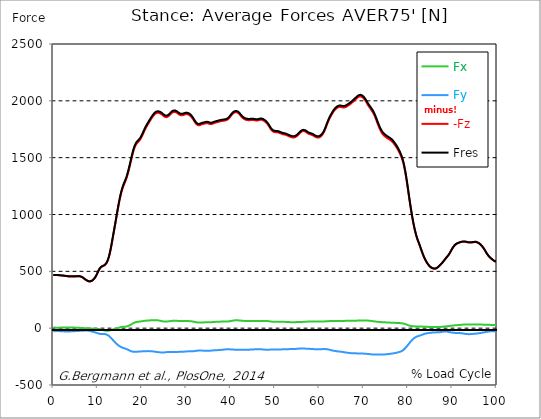
| Category |  Fx |  Fy |  -Fz |  Fres |
|---|---|---|---|---|
| 0.0 | 5.46 | -26.686 | 466.61 | 467.876 |
| 0.167348456675344 | 5.308 | -26.487 | 466.642 | 467.908 |
| 0.334696913350688 | 5.086 | -26.224 | 466.762 | 468.011 |
| 0.5020453700260321 | 4.807 | -25.937 | 466.929 | 468.162 |
| 0.669393826701376 | 4.521 | -25.699 | 467.048 | 468.266 |
| 0.83674228337672 | 4.33 | -25.571 | 466.977 | 468.178 |
| 1.0040907400520642 | 4.314 | -25.579 | 466.563 | 467.765 |
| 1.1621420602454444 | 4.441 | -25.738 | 465.839 | 467.032 |
| 1.3294905169207885 | 4.68 | -26.017 | 464.987 | 466.197 |
| 1.4968389735961325 | 4.982 | -26.367 | 464.247 | 465.464 |
| 1.6641874302714765 | 5.293 | -26.733 | 463.658 | 464.891 |
| 1.8315358869468206 | 5.595 | -27.107 | 463.156 | 464.414 |
| 1.9988843436221646 | 5.889 | -27.473 | 462.631 | 463.905 |
| 2.1662328002975086 | 6.144 | -27.84 | 461.963 | 463.252 |
| 2.333581256972853 | 6.335 | -28.198 | 461.143 | 462.456 |
| 2.5009297136481967 | 6.447 | -28.508 | 460.283 | 461.612 |
| 2.6682781703235405 | 6.462 | -28.739 | 459.456 | 460.801 |
| 2.8356266269988843 | 6.439 | -28.89 | 458.628 | 459.973 |
| 3.002975083674229 | 6.407 | -28.97 | 457.721 | 459.074 |
| 3.1703235403495724 | 6.367 | -28.994 | 456.766 | 458.119 |
| 3.337671997024917 | 6.319 | -28.97 | 455.834 | 457.187 |
| 3.4957233172182973 | 6.208 | -28.874 | 455.054 | 456.415 |
| 3.663071773893641 | 6.017 | -28.691 | 454.553 | 455.906 |
| 3.8304202305689854 | 5.778 | -28.421 | 454.346 | 455.683 |
| 3.997768687244329 | 5.523 | -28.086 | 454.338 | 455.667 |
| 4.165117143919673 | 5.308 | -27.704 | 454.41 | 455.731 |
| 4.332465600595017 | 5.141 | -27.322 | 454.466 | 455.763 |
| 4.499814057270361 | 5.014 | -26.948 | 454.513 | 455.803 |
| 4.667162513945706 | 4.895 | -26.582 | 454.672 | 455.938 |
| 4.834510970621049 | 4.767 | -26.216 | 455.039 | 456.288 |
| 5.001859427296393 | 4.624 | -25.858 | 455.596 | 456.837 |
| 5.169207883971737 | 4.465 | -25.524 | 456.193 | 457.418 |
| 5.336556340647081 | 4.25 | -25.197 | 456.598 | 457.808 |
| 5.503904797322425 | 3.94 | -24.879 | 456.758 | 457.951 |
| 5.671253253997769 | 3.526 | -24.537 | 456.694 | 457.864 |
| 5.82930457419115 | 3.008 | -24.155 | 456.384 | 457.514 |
| 5.996653030866494 | 2.475 | -23.749 | 455.62 | 456.718 |
| 6.164001487541838 | 1.982 | -23.375 | 454.139 | 455.198 |
| 6.331349944217181 | 1.544 | -23.04 | 451.736 | 452.77 |
| 6.498698400892526 | 1.154 | -22.73 | 448.401 | 449.404 |
| 6.66604685756787 | 0.772 | -22.396 | 444.262 | 445.233 |
| 6.833395314243213 | 0.366 | -22.038 | 439.535 | 440.482 |
| 7.000743770918558 | -0.08 | -21.679 | 434.521 | 435.444 |
| 7.168092227593902 | -0.565 | -21.361 | 429.515 | 430.422 |
| 7.335440684269246 | -1.074 | -21.17 | 424.819 | 425.719 |
| 7.50278914094459 | -1.568 | -21.154 | 420.593 | 421.493 |
| 7.6701375976199335 | -1.998 | -21.401 | 416.924 | 417.832 |
| 7.837486054295278 | -2.348 | -21.942 | 413.892 | 414.823 |
| 7.995537374488658 | -2.61 | -22.81 | 411.711 | 412.698 |
| 8.162885831164003 | -2.833 | -24.043 | 410.685 | 411.743 |
| 8.330234287839346 | -3.088 | -25.595 | 411.003 | 412.157 |
| 8.49758274451469 | -3.422 | -27.306 | 412.706 | 413.972 |
| 8.664931201190035 | -3.884 | -29.049 | 415.786 | 417.171 |
| 8.832279657865378 | -4.457 | -30.729 | 420.203 | 421.7 |
| 8.999628114540721 | -5.109 | -32.424 | 425.79 | 427.406 |
| 9.166976571216066 | -5.77 | -34.206 | 432.476 | 434.227 |
| 9.334325027891412 | -6.367 | -36.093 | 440.482 | 442.368 |
| 9.501673484566755 | -6.837 | -38.058 | 450.128 | 452.15 |
| 9.669021941242098 | -7.171 | -40.096 | 461.589 | 463.753 |
| 9.836370397917442 | -7.37 | -42.221 | 474.681 | 476.981 |
| 10.003718854592787 | -7.497 | -44.425 | 488.76 | 491.203 |
| 10.17106731126813 | -7.704 | -46.646 | 502.775 | 505.361 |
| 10.329118631461512 | -8.213 | -48.636 | 515.294 | 518.032 |
| 10.496467088136853 | -9.145 | -50.331 | 525.608 | 528.473 |
| 10.663815544812199 | -10.498 | -51.564 | 533.328 | 536.289 |
| 10.831164001487544 | -12.24 | -52.297 | 538.7 | 541.741 |
| 10.998512458162887 | -14.238 | -52.48 | 542.353 | 545.418 |
| 11.16586091483823 | -16.228 | -52.241 | 545.131 | 548.179 |
| 11.333209371513574 | -18.026 | -51.827 | 547.829 | 550.853 |
| 11.50055782818892 | -19.555 | -51.771 | 551.387 | 554.427 |
| 11.667906284864264 | -20.78 | -52.265 | 556.615 | 559.719 |
| 11.835254741539607 | -21.711 | -53.395 | 563.643 | 566.866 |
| 12.00260319821495 | -22.332 | -55.393 | 572.971 | 576.377 |
| 12.169951654890292 | -22.475 | -58.353 | 585.704 | 589.365 |
| 12.337300111565641 | -22.157 | -62.245 | 602.044 | 606.023 |
| 12.504648568240984 | -21.353 | -67.108 | 622.362 | 626.732 |
| 12.662699888434362 | -20.08 | -72.798 | 646.724 | 651.539 |
| 12.830048345109708 | -18.401 | -79.094 | 675.073 | 680.365 |
| 12.997396801785053 | -16.514 | -85.819 | 706.987 | 712.805 |
| 13.164745258460396 | -14.58 | -92.798 | 741.854 | 748.197 |
| 13.33209371513574 | -12.726 | -99.906 | 778.544 | 785.436 |
| 13.499442171811083 | -11.015 | -107.029 | 815.281 | 822.73 |
| 13.666790628486426 | -9.439 | -114.112 | 851.191 | 859.189 |
| 13.834139085161771 | -7.895 | -121.06 | 886.822 | 895.377 |
| 14.001487541837117 | -6.2 | -127.777 | 923.209 | 932.282 |
| 14.16883599851246 | -4.266 | -134.2 | 960.503 | 970.062 |
| 14.336184455187803 | -2.101 | -140.256 | 998.188 | 1008.176 |
| 14.503532911863147 | 0.215 | -145.907 | 1035.435 | 1045.821 |
| 14.670881368538492 | 2.507 | -151.144 | 1071.376 | 1082.128 |
| 14.828932688731873 | 4.68 | -155.927 | 1105.463 | 1116.534 |
| 14.996281145407215 | 6.653 | -160.24 | 1137.322 | 1148.687 |
| 15.163629602082558 | 8.333 | -164.069 | 1166.387 | 1177.999 |
| 15.330978058757903 | 9.686 | -167.459 | 1192.484 | 1204.302 |
| 15.498326515433247 | 10.736 | -170.388 | 1215.651 | 1227.653 |
| 15.665674972108594 | 11.5 | -172.815 | 1236.065 | 1248.202 |
| 15.833023428783937 | 12.049 | -174.845 | 1254.155 | 1266.396 |
| 16.00037188545928 | 12.487 | -176.747 | 1270.192 | 1282.552 |
| 16.167720342134626 | 13.005 | -178.713 | 1285.25 | 1297.745 |
| 16.335068798809967 | 13.808 | -181.005 | 1301.271 | 1313.933 |
| 16.502417255485312 | 15.01 | -183.647 | 1319.401 | 1332.27 |
| 16.669765712160658 | 16.65 | -186.616 | 1340.189 | 1353.289 |
| 16.837114168836 | 18.775 | -189.831 | 1363.269 | 1376.632 |
| 17.004462625511344 | 21.401 | -193.086 | 1388.204 | 1401.821 |
| 17.16251394570472 | 24.441 | -196.246 | 1414.579 | 1428.435 |
| 17.32986240238007 | 27.792 | -199.23 | 1442.06 | 1456.131 |
| 17.497210859055414 | 31.389 | -201.912 | 1470.274 | 1484.52 |
| 17.664559315730756 | 35.233 | -204.212 | 1498.304 | 1512.694 |
| 17.8319077724061 | 39.109 | -205.987 | 1525.07 | 1539.538 |
| 17.999256229081443 | 42.834 | -207.205 | 1549.678 | 1564.179 |
| 18.166604685756788 | 46.272 | -207.881 | 1571.421 | 1585.906 |
| 18.333953142432133 | 49.28 | -208.112 | 1589.925 | 1604.354 |
| 18.501301599107478 | 51.716 | -208.024 | 1604.999 | 1619.348 |
| 18.668650055782823 | 53.594 | -207.77 | 1617.064 | 1631.326 |
| 18.835998512458165 | 54.987 | -207.348 | 1626.511 | 1640.678 |
| 19.00334696913351 | 55.997 | -206.815 | 1633.984 | 1648.055 |
| 19.170695425808855 | 56.761 | -206.305 | 1640.566 | 1654.534 |
| 19.338043882484197 | 57.43 | -205.812 | 1647.363 | 1661.235 |
| 19.496095202677576 | 58.154 | -205.326 | 1655.505 | 1669.273 |
| 19.66344365935292 | 58.95 | -204.897 | 1665.198 | 1678.855 |
| 19.830792116028263 | 59.857 | -204.475 | 1676.723 | 1690.268 |
| 19.998140572703612 | 60.844 | -204.029 | 1689.783 | 1703.209 |
| 20.165489029378953 | 61.879 | -203.623 | 1703.941 | 1717.24 |
| 20.3328374860543 | 62.921 | -203.289 | 1718.641 | 1731.829 |
| 20.500185942729644 | 63.916 | -203.01 | 1733.253 | 1746.337 |
| 20.667534399404985 | 64.84 | -202.772 | 1747.245 | 1760.225 |
| 20.83488285608033 | 65.659 | -202.533 | 1760.408 | 1773.301 |
| 21.002231312755672 | 66.336 | -202.286 | 1772.712 | 1785.51 |
| 21.16957976943102 | 66.877 | -202.055 | 1784.189 | 1796.891 |
| 21.336928226106362 | 67.339 | -201.912 | 1795.259 | 1807.89 |
| 21.504276682781704 | 67.784 | -201.896 | 1806.179 | 1818.746 |
| 21.67162513945705 | 68.222 | -202.04 | 1816.835 | 1829.354 |
| 21.82967645965043 | 68.668 | -202.326 | 1827.222 | 1839.725 |
| 21.997024916325774 | 69.089 | -202.66 | 1837.417 | 1849.904 |
| 22.16437337300112 | 69.487 | -203.13 | 1847.365 | 1859.86 |
| 22.33172182967646 | 69.83 | -203.751 | 1856.995 | 1869.506 |
| 22.499070286351806 | 70.108 | -204.562 | 1866.148 | 1878.698 |
| 22.666418743027148 | 70.339 | -205.525 | 1874.504 | 1887.111 |
| 22.833767199702496 | 70.506 | -206.576 | 1881.747 | 1894.425 |
| 23.00111565637784 | 70.546 | -207.603 | 1887.541 | 1900.298 |
| 23.168464113053183 | 70.395 | -208.534 | 1891.591 | 1904.413 |
| 23.335812569728528 | 69.965 | -209.433 | 1894.027 | 1906.912 |
| 23.50316102640387 | 69.241 | -210.332 | 1895.093 | 1908.034 |
| 23.670509483079215 | 68.262 | -211.144 | 1894.95 | 1907.947 |
| 23.83785793975456 | 67.076 | -211.845 | 1893.732 | 1906.769 |
| 23.995909259947936 | 65.715 | -212.465 | 1891.584 | 1904.66 |
| 24.163257716623285 | 64.251 | -213.015 | 1888.583 | 1901.691 |
| 24.330606173298627 | 62.73 | -213.484 | 1884.707 | 1897.839 |
| 24.49795462997397 | 61.37 | -213.779 | 1879.757 | 1892.921 |
| 24.665303086649313 | 60.2 | -213.858 | 1873.955 | 1887.135 |
| 24.83265154332466 | 59.284 | -213.675 | 1868.034 | 1881.213 |
| 25.0 | 58.679 | -213.245 | 1862.916 | 1876.056 |
| 25.167348456675345 | 58.385 | -212.633 | 1858.985 | 1872.077 |
| 25.334696913350694 | 58.353 | -211.892 | 1856.613 | 1869.633 |
| 25.502045370026035 | 58.488 | -211.136 | 1856.096 | 1869.037 |
| 25.669393826701377 | 58.815 | -210.42 | 1857.536 | 1870.397 |
| 25.836742283376722 | 59.316 | -209.839 | 1860.911 | 1873.7 |
| 26.004090740052067 | 59.985 | -209.425 | 1866.028 | 1878.754 |
| 26.17143919672741 | 60.812 | -209.178 | 1872.451 | 1885.129 |
| 26.329490516920792 | 61.744 | -209.059 | 1879.454 | 1892.101 |
| 26.49683897359613 | 62.675 | -208.995 | 1886.164 | 1898.786 |
| 26.66418743027148 | 63.55 | -208.987 | 1892.141 | 1904.755 |
| 26.831535886946828 | 64.33 | -209.019 | 1897.099 | 1909.705 |
| 26.998884343622166 | 64.967 | -209.067 | 1900.768 | 1913.382 |
| 27.166232800297514 | 65.373 | -209.107 | 1902.853 | 1915.476 |
| 27.333581256972852 | 65.524 | -209.107 | 1903.307 | 1915.929 |
| 27.5009297136482 | 65.428 | -209.075 | 1902.24 | 1914.863 |
| 27.668278170323543 | 65.158 | -209.011 | 1899.861 | 1912.491 |
| 27.835626626998888 | 64.728 | -208.916 | 1896.327 | 1908.957 |
| 28.002975083674233 | 64.163 | -208.788 | 1891.639 | 1904.27 |
| 28.170323540349575 | 63.518 | -208.621 | 1886.172 | 1898.802 |
| 28.33767199702492 | 62.914 | -208.446 | 1880.863 | 1893.494 |
| 28.50502045370026 | 62.484 | -208.295 | 1876.78 | 1889.411 |
| 28.663071773893645 | 62.269 | -208.168 | 1874.122 | 1886.761 |
| 28.830420230568986 | 62.229 | -208.04 | 1872.849 | 1885.487 |
| 28.99776868724433 | 62.285 | -207.881 | 1872.785 | 1885.416 |
| 29.165117143919673 | 62.412 | -207.658 | 1873.796 | 1886.402 |
| 29.33246560059502 | 62.627 | -207.348 | 1875.738 | 1888.312 |
| 29.499814057270367 | 62.937 | -206.839 | 1878.285 | 1890.796 |
| 29.66716251394571 | 63.168 | -206.154 | 1880.76 | 1893.183 |
| 29.834510970621054 | 63.232 | -205.446 | 1882.71 | 1895.046 |
| 30.00185942729639 | 63.128 | -204.817 | 1883.649 | 1895.913 |
| 30.169207883971744 | 62.914 | -204.3 | 1883.529 | 1895.722 |
| 30.33655634064708 | 62.611 | -203.942 | 1882.208 | 1894.361 |
| 30.50390479732243 | 62.237 | -203.798 | 1879.415 | 1891.552 |
| 30.671253253997772 | 61.823 | -203.87 | 1875.396 | 1887.556 |
| 30.829304574191156 | 61.393 | -204.053 | 1870.421 | 1882.614 |
| 30.996653030866494 | 60.932 | -204.228 | 1864.627 | 1876.86 |
| 31.164001487541842 | 60.351 | -204.268 | 1857.751 | 1870 |
| 31.331349944217187 | 59.539 | -204.005 | 1849.355 | 1861.611 |
| 31.498698400892525 | 58.496 | -203.472 | 1839.741 | 1851.957 |
| 31.666046857567874 | 57.239 | -202.652 | 1829.259 | 1841.42 |
| 31.833395314243212 | 55.814 | -201.61 | 1818.427 | 1830.501 |
| 32.00074377091856 | 54.302 | -200.48 | 1808.367 | 1820.337 |
| 32.1680922275939 | 52.83 | -199.421 | 1799.724 | 1811.591 |
| 32.33544068426925 | 51.517 | -198.554 | 1792.8 | 1804.587 |
| 32.50278914094459 | 50.418 | -197.869 | 1787.762 | 1799.47 |
| 32.670137597619934 | 49.646 | -197.344 | 1784.985 | 1796.636 |
| 32.83748605429528 | 49.217 | -197.01 | 1784.499 | 1796.103 |
| 33.004834510970625 | 49.089 | -196.874 | 1785.852 | 1797.424 |
| 33.162885831164004 | 49.225 | -196.882 | 1788.407 | 1799.971 |
| 33.33023428783935 | 49.511 | -197.041 | 1791.376 | 1802.94 |
| 33.497582744514695 | 49.829 | -197.304 | 1793.954 | 1805.534 |
| 33.664931201190036 | 50.156 | -197.567 | 1795.984 | 1807.579 |
| 33.83227965786538 | 50.49 | -197.774 | 1797.496 | 1809.108 |
| 33.99962811454073 | 50.84 | -197.965 | 1798.833 | 1810.461 |
| 34.16697657121607 | 51.198 | -198.219 | 1800.472 | 1812.124 |
| 34.33432502789141 | 51.541 | -198.506 | 1802.279 | 1813.946 |
| 34.50167348456676 | 51.819 | -198.832 | 1803.6 | 1815.299 |
| 34.6690219412421 | 52.018 | -199.15 | 1803.863 | 1815.602 |
| 34.83637039791744 | 52.153 | -199.334 | 1802.94 | 1814.703 |
| 35.00371885459279 | 52.217 | -199.27 | 1801.014 | 1812.776 |
| 35.17106731126814 | 52.257 | -198.928 | 1798.499 | 1810.246 |
| 35.338415767943474 | 52.313 | -198.394 | 1796.334 | 1808.033 |
| 35.49646708813686 | 52.456 | -197.758 | 1795.411 | 1807.054 |
| 35.6638155448122 | 52.726 | -197.113 | 1795.872 | 1807.444 |
| 35.831164001487544 | 53.1 | -196.492 | 1797.552 | 1809.06 |
| 35.998512458162885 | 53.586 | -195.927 | 1799.979 | 1811.424 |
| 36.165860914838234 | 54.119 | -195.362 | 1802.605 | 1813.986 |
| 36.333209371513576 | 54.66 | -194.861 | 1805.192 | 1816.525 |
| 36.50055782818892 | 55.17 | -194.455 | 1807.564 | 1818.857 |
| 36.667906284864266 | 55.647 | -194.089 | 1809.609 | 1820.863 |
| 36.83525474153961 | 56.085 | -193.715 | 1811.376 | 1822.59 |
| 37.002603198214956 | 56.467 | -193.253 | 1812.999 | 1824.173 |
| 37.1699516548903 | 56.777 | -192.712 | 1814.615 | 1825.725 |
| 37.337300111565646 | 57.024 | -192.131 | 1816.318 | 1827.373 |
| 37.50464856824098 | 57.255 | -191.637 | 1818.109 | 1829.1 |
| 37.66269988843437 | 57.494 | -191.232 | 1819.764 | 1830.715 |
| 37.83004834510971 | 57.748 | -190.818 | 1821.213 | 1832.116 |
| 37.99739680178505 | 57.979 | -190.348 | 1822.462 | 1833.326 |
| 38.16474525846039 | 58.146 | -189.799 | 1823.624 | 1834.432 |
| 38.33209371513574 | 58.21 | -189.162 | 1824.707 | 1835.443 |
| 38.49944217181109 | 58.17 | -188.398 | 1825.638 | 1836.286 |
| 38.666790628486424 | 58.098 | -187.61 | 1826.545 | 1837.114 |
| 38.83413908516178 | 58.075 | -186.878 | 1827.803 | 1838.284 |
| 39.001487541837115 | 58.186 | -186.321 | 1829.808 | 1840.234 |
| 39.16883599851246 | 58.488 | -185.995 | 1832.737 | 1843.123 |
| 39.336184455187805 | 59.014 | -185.875 | 1836.804 | 1847.174 |
| 39.503532911863154 | 59.762 | -185.907 | 1842.232 | 1852.594 |
| 39.670881368538495 | 60.669 | -186.066 | 1849.052 | 1859.422 |
| 39.83822982521384 | 61.696 | -186.353 | 1857.027 | 1867.413 |
| 39.996281145407224 | 62.834 | -186.751 | 1865.598 | 1876.024 |
| 40.163629602082565 | 64.02 | -187.212 | 1874.066 | 1884.524 |
| 40.33097805875791 | 65.229 | -187.714 | 1881.675 | 1892.18 |
| 40.498326515433256 | 66.376 | -188.207 | 1888.05 | 1898.611 |
| 40.6656749721086 | 67.37 | -188.653 | 1893.112 | 1903.721 |
| 40.83302342878393 | 68.19 | -189.011 | 1896.892 | 1907.541 |
| 41.00037188545929 | 68.795 | -189.298 | 1899.343 | 1910.032 |
| 41.16772034213463 | 69.177 | -189.544 | 1900.306 | 1911.027 |
| 41.33506879880997 | 69.312 | -189.759 | 1899.709 | 1910.454 |
| 41.50241725548531 | 69.185 | -189.95 | 1897.576 | 1908.345 |
| 41.66976571216066 | 68.843 | -190.117 | 1893.884 | 1904.684 |
| 41.837114168836 | 68.333 | -190.285 | 1888.695 | 1899.518 |
| 42.004462625511344 | 67.705 | -190.444 | 1882.089 | 1892.952 |
| 42.17181108218669 | 66.98 | -190.579 | 1874.21 | 1885.105 |
| 42.32986240238007 | 66.232 | -190.698 | 1865.67 | 1876.597 |
| 42.497210859055414 | 65.532 | -190.786 | 1857.799 | 1868.758 |
| 42.66455931573076 | 64.943 | -190.873 | 1851.185 | 1862.168 |
| 42.831907772406105 | 64.489 | -190.913 | 1845.781 | 1856.788 |
| 42.999256229081446 | 64.139 | -190.873 | 1841.324 | 1852.339 |
| 43.16660468575679 | 63.861 | -190.73 | 1837.544 | 1848.559 |
| 43.33395314243214 | 63.654 | -190.531 | 1834.575 | 1845.574 |
| 43.50130159910748 | 63.518 | -190.292 | 1832.442 | 1843.417 |
| 43.66865005578282 | 63.463 | -190.022 | 1831.082 | 1842.033 |
| 43.83599851245817 | 63.487 | -189.719 | 1830.381 | 1841.308 |
| 44.00334696913351 | 63.534 | -189.401 | 1830.031 | 1840.934 |
| 44.17069542580886 | 63.598 | -189.107 | 1829.951 | 1840.823 |
| 44.3380438824842 | 63.709 | -188.804 | 1830.23 | 1841.062 |
| 44.49609520267758 | 63.805 | -188.494 | 1830.819 | 1841.619 |
| 44.66344365935292 | 63.861 | -188.136 | 1831.591 | 1842.359 |
| 44.83079211602827 | 63.853 | -187.73 | 1832.132 | 1842.852 |
| 44.99814057270361 | 63.765 | -187.3 | 1831.989 | 1842.669 |
| 45.16548902937895 | 63.638 | -186.87 | 1831.28 | 1841.913 |
| 45.332837486054295 | 63.487 | -186.448 | 1830.095 | 1840.688 |
| 45.500185942729644 | 63.327 | -186.043 | 1828.71 | 1839.263 |
| 45.66753439940499 | 63.184 | -185.661 | 1827.619 | 1838.133 |
| 45.83488285608033 | 63.073 | -185.31 | 1827.214 | 1837.695 |
| 46.00223131275568 | 62.977 | -185.008 | 1827.564 | 1838.014 |
| 46.16957976943102 | 62.914 | -184.801 | 1828.662 | 1839.08 |
| 46.336928226106366 | 62.898 | -184.777 | 1830.365 | 1840.775 |
| 46.50427668278171 | 62.953 | -184.96 | 1832.1 | 1842.526 |
| 46.671625139457056 | 63.112 | -185.302 | 1833.302 | 1843.76 |
| 46.829676459650436 | 63.359 | -185.764 | 1833.628 | 1844.142 |
| 46.99702491632577 | 63.63 | -186.297 | 1833 | 1843.585 |
| 47.16437337300112 | 63.892 | -186.862 | 1831.376 | 1842.033 |
| 47.33172182967646 | 64.06 | -187.451 | 1828.734 | 1839.47 |
| 47.49907028635181 | 64.107 | -188.024 | 1825.152 | 1835.968 |
| 47.66641874302716 | 64.02 | -188.557 | 1820.743 | 1831.631 |
| 47.83376719970249 | 63.877 | -189.075 | 1815.61 | 1826.593 |
| 48.001115656377834 | 63.614 | -189.505 | 1809.617 | 1820.664 |
| 48.16846411305319 | 63.224 | -189.751 | 1802.621 | 1813.724 |
| 48.33581256972853 | 62.675 | -189.799 | 1794.591 | 1805.733 |
| 48.50316102640387 | 61.919 | -189.648 | 1785.526 | 1796.684 |
| 48.67050948307921 | 60.988 | -189.314 | 1775.586 | 1786.736 |
| 48.837857939754564 | 59.929 | -188.796 | 1764.897 | 1776.023 |
| 49.005206396429905 | 58.831 | -188.231 | 1754.288 | 1765.382 |
| 49.163257716623285 | 57.828 | -187.762 | 1744.984 | 1756.055 |
| 49.33060617329863 | 56.944 | -187.427 | 1737.384 | 1748.438 |
| 49.49795462997397 | 56.252 | -187.204 | 1731.669 | 1742.716 |
| 49.66530308664932 | 55.783 | -187.029 | 1727.698 | 1738.737 |
| 49.832651543324666 | 55.528 | -186.886 | 1725.406 | 1736.445 |
| 50.0 | 55.432 | -186.807 | 1724.411 | 1735.442 |
| 50.16734845667534 | 55.456 | -186.791 | 1724.101 | 1735.131 |
| 50.33469691335069 | 55.552 | -186.83 | 1723.846 | 1734.893 |
| 50.50204537002604 | 55.679 | -186.926 | 1723.217 | 1734.296 |
| 50.66939382670139 | 55.783 | -187.045 | 1722.175 | 1733.269 |
| 50.836742283376715 | 55.814 | -187.117 | 1720.591 | 1731.709 |
| 51.00409074005207 | 55.719 | -187.093 | 1718.291 | 1729.417 |
| 51.17143919672741 | 55.56 | -186.982 | 1715.362 | 1726.488 |
| 51.32949051692079 | 55.416 | -186.815 | 1712.306 | 1723.432 |
| 51.496838973596134 | 55.385 | -186.639 | 1709.656 | 1720.782 |
| 51.66418743027148 | 55.432 | -186.48 | 1707.451 | 1718.569 |
| 51.831535886946824 | 55.528 | -186.345 | 1705.676 | 1716.803 |
| 51.99888434362217 | 55.552 | -186.162 | 1704.291 | 1715.418 |
| 52.16623280029752 | 55.4 | -185.828 | 1703.313 | 1714.399 |
| 52.33358125697285 | 55.146 | -185.462 | 1702.159 | 1713.205 |
| 52.5009297136482 | 54.915 | -185.239 | 1700.105 | 1711.144 |
| 52.668278170323546 | 54.668 | -185.095 | 1697.28 | 1708.311 |
| 52.835626626998895 | 54.366 | -184.952 | 1694.104 | 1705.127 |
| 53.00297508367424 | 54.008 | -184.737 | 1690.913 | 1701.92 |
| 53.17032354034958 | 53.602 | -184.419 | 1687.968 | 1698.951 |
| 53.33767199702492 | 53.18 | -184.045 | 1685.302 | 1696.253 |
| 53.50502045370027 | 52.758 | -183.687 | 1682.962 | 1693.882 |
| 53.663071773893655 | 52.376 | -183.376 | 1681.02 | 1691.916 |
| 53.83042023056899 | 52.098 | -183.154 | 1679.381 | 1690.26 |
| 53.99776868724433 | 51.986 | -183.058 | 1677.988 | 1688.86 |
| 54.16511714391967 | 52.05 | -183.018 | 1677.256 | 1688.127 |
| 54.33246560059503 | 52.249 | -182.947 | 1677.805 | 1688.677 |
| 54.49981405727037 | 52.583 | -182.764 | 1679.699 | 1690.555 |
| 54.667162513945705 | 53.005 | -182.477 | 1682.827 | 1693.651 |
| 54.834510970621054 | 53.451 | -182.079 | 1686.981 | 1697.765 |
| 55.0018594272964 | 53.88 | -181.562 | 1692.091 | 1702.811 |
| 55.169207883971744 | 54.207 | -180.925 | 1698.1 | 1708.74 |
| 55.336556340647086 | 54.35 | -180.225 | 1704.841 | 1715.394 |
| 55.50390479732243 | 54.382 | -179.564 | 1711.86 | 1722.318 |
| 55.671253253997776 | 54.43 | -179.039 | 1718.609 | 1728.987 |
| 55.83860171067312 | 54.557 | -178.721 | 1724.562 | 1734.885 |
| 55.9966530308665 | 54.788 | -178.633 | 1729.33 | 1739.636 |
| 56.16400148754184 | 55.034 | -178.689 | 1732.68 | 1742.987 |
| 56.33134994421718 | 55.337 | -178.896 | 1734.383 | 1744.706 |
| 56.498698400892536 | 55.719 | -179.222 | 1734.471 | 1744.833 |
| 56.66604685756788 | 56.172 | -179.596 | 1733.022 | 1743.44 |
| 56.83339531424321 | 56.642 | -179.938 | 1730.181 | 1740.663 |
| 57.00074377091856 | 57.064 | -180.296 | 1726.122 | 1736.66 |
| 57.16809222759391 | 57.366 | -180.662 | 1721.315 | 1731.932 |
| 57.33544068426925 | 57.621 | -181.052 | 1716.532 | 1727.213 |
| 57.5027891409446 | 57.892 | -181.442 | 1712.473 | 1723.225 |
| 57.670137597619934 | 58.083 | -181.769 | 1709.321 | 1720.121 |
| 57.83748605429528 | 58.194 | -182.055 | 1706.806 | 1717.646 |
| 58.004834510970625 | 58.226 | -182.358 | 1704.642 | 1715.529 |
| 58.16288583116401 | 58.202 | -182.74 | 1702.604 | 1713.532 |
| 58.330234287839346 | 58.138 | -183.201 | 1700.36 | 1711.351 |
| 58.497582744514695 | 58.091 | -183.695 | 1697.471 | 1708.526 |
| 58.66493120119004 | 58.019 | -184.204 | 1693.874 | 1704.992 |
| 58.832279657865385 | 57.915 | -184.682 | 1689.719 | 1700.917 |
| 58.999628114540734 | 57.78 | -185.111 | 1685.445 | 1696.699 |
| 59.16697657121607 | 57.709 | -185.469 | 1681.713 | 1693.022 |
| 59.33432502789142 | 57.716 | -185.748 | 1678.8 | 1690.157 |
| 59.50167348456676 | 57.772 | -185.899 | 1676.914 | 1688.302 |
| 59.66902194124211 | 57.82 | -185.987 | 1676.213 | 1687.618 |
| 59.83637039791745 | 57.876 | -185.987 | 1676.746 | 1688.143 |
| 60.00371885459278 | 57.971 | -185.891 | 1678.641 | 1690.022 |
| 60.17106731126813 | 58.106 | -185.684 | 1681.967 | 1693.316 |
| 60.33841576794349 | 58.274 | -185.382 | 1686.711 | 1698.004 |
| 60.49646708813685 | 58.473 | -184.976 | 1693.014 | 1704.228 |
| 60.6638155448122 | 58.695 | -184.53 | 1700.981 | 1712.115 |
| 60.831164001487544 | 58.966 | -184.14 | 1710.674 | 1721.721 |
| 60.99851245816289 | 59.268 | -183.878 | 1722.278 | 1733.237 |
| 61.16586091483824 | 59.579 | -183.782 | 1735.832 | 1746.703 |
| 61.333209371513576 | 59.857 | -183.91 | 1751.192 | 1762 |
| 61.50055782818892 | 60.176 | -184.3 | 1768.009 | 1778.761 |
| 61.667906284864266 | 60.613 | -184.992 | 1785.629 | 1796.358 |
| 61.835254741539615 | 61.123 | -185.947 | 1802.725 | 1813.469 |
| 62.002603198214956 | 61.624 | -187.157 | 1818.491 | 1829.283 |
| 62.16995165489029 | 62.03 | -188.518 | 1833.581 | 1844.444 |
| 62.33730011156564 | 62.333 | -190.038 | 1847.588 | 1858.531 |
| 62.504648568240995 | 62.524 | -191.749 | 1860.075 | 1871.13 |
| 62.67199702491633 | 62.643 | -193.516 | 1871.448 | 1882.622 |
| 62.83004834510971 | 62.667 | -195.227 | 1882.336 | 1893.621 |
| 62.99739680178505 | 62.579 | -196.763 | 1893.334 | 1904.715 |
| 63.1647452584604 | 62.524 | -198.108 | 1903.896 | 1915.34 |
| 63.33209371513575 | 62.539 | -199.342 | 1913.104 | 1924.62 |
| 63.4994421718111 | 62.547 | -200.472 | 1921.007 | 1932.595 |
| 63.666790628486424 | 62.508 | -201.506 | 1927.748 | 1939.399 |
| 63.83413908516177 | 62.428 | -202.461 | 1933.502 | 1945.225 |
| 64.00148754183712 | 62.293 | -203.321 | 1938.325 | 1950.104 |
| 64.16883599851248 | 62.173 | -204.101 | 1942.209 | 1954.043 |
| 64.3361844551878 | 62.062 | -204.841 | 1945.122 | 1957.02 |
| 64.50353291186315 | 61.974 | -205.573 | 1946.92 | 1958.882 |
| 64.6708813685385 | 61.935 | -206.337 | 1947.493 | 1959.535 |
| 64.83822982521384 | 62.006 | -207.149 | 1946.896 | 1959.041 |
| 65.00557828188919 | 62.261 | -207.993 | 1945.297 | 1957.561 |
| 65.16362960208257 | 62.715 | -208.916 | 1943.22 | 1955.619 |
| 65.3309780587579 | 63.216 | -209.887 | 1941.548 | 1954.091 |
| 65.49832651543326 | 63.646 | -210.866 | 1940.991 | 1953.685 |
| 65.6656749721086 | 64.004 | -211.884 | 1941.715 | 1954.537 |
| 65.83302342878395 | 64.282 | -212.943 | 1943.665 | 1956.614 |
| 66.00037188545929 | 64.505 | -214.025 | 1946.634 | 1959.694 |
| 66.16772034213463 | 64.696 | -215.076 | 1950.534 | 1963.697 |
| 66.33506879880998 | 64.824 | -216.071 | 1954.831 | 1968.083 |
| 66.50241725548531 | 64.903 | -217.026 | 1958.946 | 1972.277 |
| 66.66976571216065 | 65.007 | -217.885 | 1962.878 | 1976.288 |
| 66.83711416883601 | 65.086 | -218.649 | 1967.127 | 1980.586 |
| 67.00446262551135 | 65.062 | -219.27 | 1971.99 | 1985.488 |
| 67.1718110821867 | 64.999 | -219.803 | 1977.41 | 1990.932 |
| 67.32986240238007 | 64.983 | -220.273 | 1983.172 | 1996.71 |
| 67.49721085905541 | 65.086 | -220.679 | 1989.093 | 2002.639 |
| 67.66455931573076 | 65.206 | -220.886 | 1995.031 | 2008.56 |
| 67.83190777240611 | 65.341 | -221.029 | 2000.904 | 2014.418 |
| 67.99925622908145 | 65.5 | -221.22 | 2006.627 | 2020.132 |
| 68.16660468575678 | 65.691 | -221.435 | 2012.46 | 2025.958 |
| 68.33395314243214 | 65.994 | -221.69 | 2018.7 | 2032.198 |
| 68.50130159910749 | 66.352 | -221.928 | 2024.884 | 2038.39 |
| 68.66865005578282 | 66.734 | -222.143 | 2030.463 | 2043.969 |
| 68.83599851245816 | 67.1 | -222.334 | 2034.975 | 2048.489 |
| 69.00334696913352 | 67.418 | -222.485 | 2038.024 | 2051.553 |
| 69.17069542580886 | 67.665 | -222.621 | 2039.424 | 2052.97 |
| 69.3380438824842 | 67.912 | -222.788 | 2039.154 | 2052.731 |
| 69.50539233915956 | 68.087 | -223.003 | 2037.204 | 2050.829 |
| 69.66344365935292 | 68.182 | -223.305 | 2033.606 | 2047.303 |
| 69.83079211602826 | 68.166 | -223.623 | 2028.728 | 2042.496 |
| 69.99814057270362 | 68.079 | -223.958 | 2022.512 | 2036.368 |
| 70.16548902937896 | 67.943 | -224.316 | 2014.768 | 2028.728 |
| 70.33283748605429 | 67.792 | -224.698 | 2005.671 | 2019.742 |
| 70.50018594272964 | 67.585 | -225.152 | 1995.437 | 2009.619 |
| 70.667534399405 | 67.315 | -225.725 | 1984.223 | 1998.556 |
| 70.83488285608033 | 67.004 | -226.457 | 1972.46 | 1986.953 |
| 71.00223131275568 | 66.614 | -227.213 | 1961.349 | 1975.993 |
| 71.16957976943102 | 66.033 | -227.858 | 1951.29 | 1966.061 |
| 71.33692822610637 | 65.237 | -228.423 | 1942.265 | 1957.139 |
| 71.50427668278171 | 64.41 | -229.051 | 1933.327 | 1948.321 |
| 71.67162513945706 | 63.574 | -229.736 | 1924.071 | 1939.192 |
| 71.8389735961324 | 62.73 | -230.388 | 1914.441 | 1929.698 |
| 71.99702491632577 | 61.871 | -230.89 | 1904.341 | 1919.725 |
| 72.16437337300113 | 60.876 | -231.216 | 1893.358 | 1908.846 |
| 72.33172182967647 | 59.833 | -231.367 | 1880.76 | 1896.351 |
| 72.49907028635181 | 58.847 | -231.399 | 1866.466 | 1882.16 |
| 72.66641874302715 | 57.987 | -231.343 | 1850.572 | 1866.378 |
| 72.8337671997025 | 57.334 | -231.343 | 1833.612 | 1849.554 |
| 73.00111565637783 | 56.777 | -231.335 | 1816.231 | 1832.315 |
| 73.16846411305319 | 56.22 | -231.264 | 1798.793 | 1815.005 |
| 73.33581256972853 | 55.647 | -231.168 | 1781.785 | 1798.132 |
| 73.50316102640387 | 55.05 | -231.097 | 1765.788 | 1782.255 |
| 73.67050948307921 | 54.422 | -231.065 | 1751.041 | 1767.627 |
| 73.83785793975457 | 53.769 | -231.041 | 1737.551 | 1754.248 |
| 74.00520639642991 | 53.148 | -231.041 | 1725.35 | 1742.143 |
| 74.16325771662328 | 52.631 | -231.041 | 1714.598 | 1731.494 |
| 74.33060617329863 | 52.217 | -231.057 | 1705.509 | 1722.485 |
| 74.49795462997398 | 51.875 | -231.033 | 1698.076 | 1715.107 |
| 74.66530308664932 | 51.541 | -230.906 | 1691.82 | 1708.892 |
| 74.83265154332466 | 51.23 | -230.635 | 1686.289 | 1703.36 |
| 75.00000000000001 | 50.928 | -230.221 | 1681.164 | 1698.219 |
| 75.16734845667534 | 50.665 | -229.736 | 1676.277 | 1693.301 |
| 75.3346969133507 | 50.363 | -229.131 | 1671.764 | 1688.74 |
| 75.50204537002605 | 49.933 | -228.335 | 1667.872 | 1684.769 |
| 75.66939382670138 | 49.455 | -227.372 | 1664.164 | 1680.957 |
| 75.83674228337672 | 49.073 | -226.385 | 1660.176 | 1676.866 |
| 76.00409074005208 | 48.763 | -225.446 | 1655.696 | 1672.29 |
| 76.17143919672742 | 48.5 | -224.579 | 1650.952 | 1667.467 |
| 76.33878765340276 | 48.198 | -223.687 | 1645.485 | 1661.919 |
| 76.49683897359614 | 47.832 | -222.676 | 1638.99 | 1655.33 |
| 76.66418743027148 | 47.442 | -221.602 | 1631.525 | 1647.793 |
| 76.83153588694682 | 47.115 | -220.52 | 1623.113 | 1639.301 |
| 76.99888434362218 | 46.821 | -219.342 | 1614.35 | 1630.459 |
| 77.16623280029752 | 46.527 | -218.076 | 1605.349 | 1621.37 |
| 77.33358125697285 | 46.224 | -216.715 | 1595.894 | 1611.803 |
| 77.5009297136482 | 45.906 | -215.259 | 1585.826 | 1601.624 |
| 77.66827817032356 | 45.572 | -213.707 | 1574.947 | 1590.617 |
| 77.83562662699889 | 45.237 | -212.02 | 1563.255 | 1578.791 |
| 78.00297508367423 | 44.919 | -210.118 | 1550.665 | 1566.049 |
| 78.17032354034959 | 44.553 | -207.993 | 1537.143 | 1552.368 |
| 78.33767199702493 | 44.083 | -205.613 | 1522.586 | 1537.605 |
| 78.50502045370027 | 43.415 | -202.907 | 1506.725 | 1521.512 |
| 78.67236891037561 | 42.547 | -199.692 | 1488.961 | 1503.454 |
| 78.83042023056899 | 41.473 | -195.696 | 1468.38 | 1482.506 |
| 78.99776868724433 | 40.152 | -190.627 | 1443.899 | 1457.548 |
| 79.16511714391969 | 38.528 | -184.65 | 1415.025 | 1428.125 |
| 79.33246560059503 | 36.618 | -177.996 | 1382.092 | 1394.579 |
| 79.49981405727036 | 34.461 | -170.833 | 1345.553 | 1357.388 |
| 79.66716251394571 | 32.034 | -163.281 | 1305.68 | 1316.838 |
| 79.83451097062107 | 29.407 | -155.409 | 1263.133 | 1273.583 |
| 80.00185942729641 | 26.678 | -147.244 | 1218.516 | 1228.234 |
| 80.16920788397174 | 24.083 | -139.007 | 1173.335 | 1182.328 |
| 80.33655634064709 | 21.847 | -130.881 | 1128.806 | 1137.091 |
| 80.50390479732243 | 20.088 | -123.034 | 1085.964 | 1093.581 |
| 80.67125325399778 | 18.783 | -115.369 | 1044.698 | 1051.678 |
| 80.83860171067312 | 17.835 | -108.079 | 1005.128 | 1011.519 |
| 80.99665303086651 | 17.127 | -101.29 | 967.435 | 973.285 |
| 81.16400148754184 | 16.554 | -95.194 | 932.218 | 937.606 |
| 81.3313499442172 | 16.077 | -89.774 | 899.723 | 904.705 |
| 81.49869840089255 | 15.71 | -84.959 | 869.862 | 874.494 |
| 81.66604685756786 | 15.464 | -80.725 | 842.651 | 846.989 |
| 81.83339531424322 | 15.313 | -77.04 | 818.114 | 822.197 |
| 82.00074377091858 | 15.249 | -73.952 | 796.3 | 800.183 |
| 82.16809222759392 | 15.273 | -71.445 | 776.936 | 780.661 |
| 82.33544068426926 | 15.344 | -69.376 | 759.196 | 762.809 |
| 82.50278914094459 | 15.352 | -67.49 | 742.061 | 745.587 |
| 82.67013759761994 | 15.161 | -65.492 | 724.472 | 727.887 |
| 82.83748605429528 | 14.819 | -63.272 | 706.263 | 709.55 |
| 83.00483451097062 | 14.397 | -60.812 | 687.727 | 690.871 |
| 83.17218296764597 | 13.952 | -58.234 | 669.334 | 672.335 |
| 83.33023428783935 | 13.53 | -55.655 | 651.706 | 654.555 |
| 83.4975827445147 | 13.18 | -53.156 | 635.263 | 637.977 |
| 83.66493120119004 | 12.925 | -50.896 | 620.245 | 622.848 |
| 83.83227965786537 | 12.686 | -48.938 | 606.524 | 609.023 |
| 83.99962811454073 | 12.424 | -47.259 | 593.783 | 596.194 |
| 84.16697657121607 | 12.161 | -45.898 | 581.988 | 584.32 |
| 84.33432502789142 | 11.827 | -44.736 | 571.275 | 573.552 |
| 84.50167348456677 | 11.429 | -43.685 | 561.717 | 563.937 |
| 84.6690219412421 | 11.047 | -42.706 | 553.289 | 555.453 |
| 84.83637039791745 | 10.728 | -41.799 | 545.871 | 547.98 |
| 85.0037188545928 | 10.521 | -40.987 | 539.456 | 541.518 |
| 85.17106731126813 | 10.37 | -40.207 | 534.092 | 536.106 |
| 85.33841576794349 | 10.219 | -39.443 | 529.866 | 531.824 |
| 85.50576422461883 | 10.076 | -38.751 | 526.699 | 528.609 |
| 85.66381554481221 | 9.972 | -38.178 | 524.47 | 526.348 |
| 85.83116400148755 | 9.909 | -37.748 | 523.157 | 525.011 |
| 85.99851245816289 | 9.885 | -37.414 | 522.775 | 524.606 |
| 86.16586091483823 | 9.885 | -37.151 | 523.436 | 525.25 |
| 86.33320937151358 | 9.964 | -36.928 | 525.282 | 527.097 |
| 86.50055782818893 | 10.116 | -36.698 | 528.402 | 530.216 |
| 86.66790628486427 | 10.307 | -36.459 | 532.755 | 534.57 |
| 86.83525474153961 | 10.49 | -36.188 | 538.151 | 539.974 |
| 87.00260319821496 | 10.689 | -35.822 | 544.279 | 546.094 |
| 87.16995165489031 | 10.927 | -35.273 | 550.821 | 552.628 |
| 87.33730011156564 | 11.222 | -34.509 | 557.602 | 559.393 |
| 87.504648568241 | 11.628 | -33.554 | 564.526 | 566.293 |
| 87.67199702491634 | 12.145 | -32.464 | 571.594 | 573.345 |
| 87.83004834510972 | 12.75 | -31.341 | 578.916 | 580.659 |
| 87.99739680178506 | 13.402 | -30.315 | 586.636 | 588.379 |
| 88.1647452584604 | 14.071 | -29.551 | 594.952 | 596.711 |
| 88.33209371513574 | 14.747 | -29.169 | 603.667 | 605.45 |
| 88.49944217181108 | 15.464 | -29.264 | 612.175 | 613.99 |
| 88.66679062848644 | 16.252 | -29.861 | 619.983 | 621.813 |
| 88.83413908516178 | 17.215 | -30.928 | 627.281 | 629.143 |
| 89.00148754183712 | 18.122 | -32.169 | 634.977 | 636.863 |
| 89.16883599851246 | 18.862 | -33.403 | 643.739 | 645.641 |
| 89.33618445518782 | 19.547 | -34.636 | 653.712 | 655.614 |
| 89.50353291186315 | 20.199 | -35.814 | 664.758 | 666.668 |
| 89.6708813685385 | 20.86 | -36.936 | 676.537 | 678.455 |
| 89.83822982521386 | 21.6 | -38.019 | 688.252 | 690.194 |
| 90.00557828188919 | 22.388 | -39.006 | 699.522 | 701.496 |
| 90.16362960208257 | 23.208 | -39.873 | 710.011 | 712.017 |
| 90.3309780587579 | 24.075 | -40.581 | 719.267 | 721.305 |
| 90.49832651543326 | 24.903 | -41.154 | 727.17 | 729.232 |
| 90.66567497210859 | 25.611 | -41.624 | 733.49 | 735.567 |
| 90.83302342878395 | 26.144 | -42.094 | 738.448 | 740.533 |
| 91.00037188545929 | 26.542 | -42.571 | 742.395 | 744.488 |
| 91.16772034213463 | 26.869 | -42.969 | 745.658 | 747.759 |
| 91.33506879880998 | 27.211 | -43.224 | 748.5 | 750.601 |
| 91.50241725548533 | 27.656 | -43.295 | 751.086 | 753.195 |
| 91.66976571216065 | 28.206 | -43.351 | 753.45 | 755.575 |
| 91.83711416883601 | 28.866 | -43.645 | 755.734 | 757.891 |
| 92.00446262551137 | 29.606 | -44.282 | 757.772 | 759.984 |
| 92.1718110821867 | 30.315 | -45.205 | 759.252 | 761.536 |
| 92.33915953886203 | 30.943 | -46.312 | 760.103 | 762.459 |
| 92.49721085905541 | 31.453 | -47.466 | 760.438 | 762.873 |
| 92.66455931573077 | 31.827 | -48.5 | 760.454 | 762.953 |
| 92.83190777240611 | 32.082 | -49.368 | 760.016 | 762.579 |
| 92.99925622908145 | 32.265 | -50.172 | 759.101 | 761.711 |
| 93.1666046857568 | 32.408 | -50.952 | 757.732 | 760.398 |
| 93.33395314243214 | 32.527 | -51.668 | 756.108 | 758.83 |
| 93.50130159910749 | 32.655 | -52.249 | 754.508 | 757.278 |
| 93.66865005578283 | 32.798 | -52.615 | 753.235 | 756.037 |
| 93.83599851245818 | 32.838 | -52.702 | 752.813 | 755.623 |
| 94.00334696913353 | 32.718 | -52.488 | 753.299 | 756.076 |
| 94.17069542580886 | 32.551 | -52.082 | 753.896 | 756.625 |
| 94.3380438824842 | 32.44 | -51.556 | 754.055 | 756.737 |
| 94.50539233915954 | 32.456 | -50.991 | 754.198 | 756.84 |
| 94.66344365935292 | 32.559 | -50.394 | 754.731 | 757.334 |
| 94.83079211602828 | 32.734 | -49.79 | 755.79 | 758.352 |
| 94.99814057270362 | 32.933 | -49.169 | 757.039 | 759.57 |
| 95.16548902937897 | 33.005 | -48.445 | 757.978 | 760.462 |
| 95.33283748605432 | 33.029 | -47.712 | 757.525 | 759.96 |
| 95.50018594272963 | 33.045 | -47.02 | 755.686 | 758.09 |
| 95.66753439940499 | 33.06 | -46.312 | 752.964 | 755.328 |
| 95.83488285608034 | 32.989 | -45.476 | 749.733 | 752.041 |
| 96.00223131275567 | 32.83 | -44.537 | 745.905 | 748.165 |
| 96.16957976943102 | 32.607 | -43.51 | 741.377 | 743.565 |
| 96.33692822610638 | 32.312 | -42.404 | 735.997 | 738.121 |
| 96.50427668278171 | 31.954 | -41.274 | 729.773 | 731.834 |
| 96.67162513945706 | 31.532 | -40.144 | 722.602 | 724.592 |
| 96.8389735961324 | 31.071 | -39.021 | 714.516 | 716.434 |
| 96.99702491632577 | 30.633 | -37.875 | 705.714 | 707.56 |
| 97.16437337300111 | 30.259 | -36.706 | 696.235 | 698.018 |
| 97.33172182967647 | 29.941 | -35.496 | 686.024 | 687.743 |
| 97.49907028635181 | 29.726 | -34.167 | 675.12 | 676.784 |
| 97.66641874302715 | 29.622 | -32.782 | 663.819 | 665.427 |
| 97.8337671997025 | 29.559 | -31.54 | 653.178 | 654.746 |
| 98.00111565637785 | 29.479 | -30.506 | 643.668 | 645.204 |
| 98.16846411305319 | 29.36 | -29.638 | 635.208 | 636.712 |
| 98.33581256972855 | 29.193 | -28.93 | 627.886 | 629.366 |
| 98.50316102640389 | 29.001 | -28.381 | 621.431 | 622.895 |
| 98.67050948307921 | 28.787 | -27.959 | 615.502 | 616.95 |
| 98.83785793975456 | 28.572 | -27.641 | 610.042 | 611.475 |
| 99.0052063964299 | 28.421 | -27.41 | 604.742 | 606.174 |
| 99.17255485310525 | 28.357 | -27.29 | 599.385 | 600.818 |
| 99.33060617329863 | 28.349 | -27.243 | 594.284 | 595.732 |
| 99.49795462997399 | 28.245 | -27.131 | 590.129 | 591.578 |
| 99.66530308664933 | 27.999 | -26.924 | 587.28 | 588.705 |
| 99.83265154332467 | 27.672 | -26.686 | 585.641 | 587.042 |
| 100.0 | 27.418 | -26.51 | 584.948 | 586.325 |